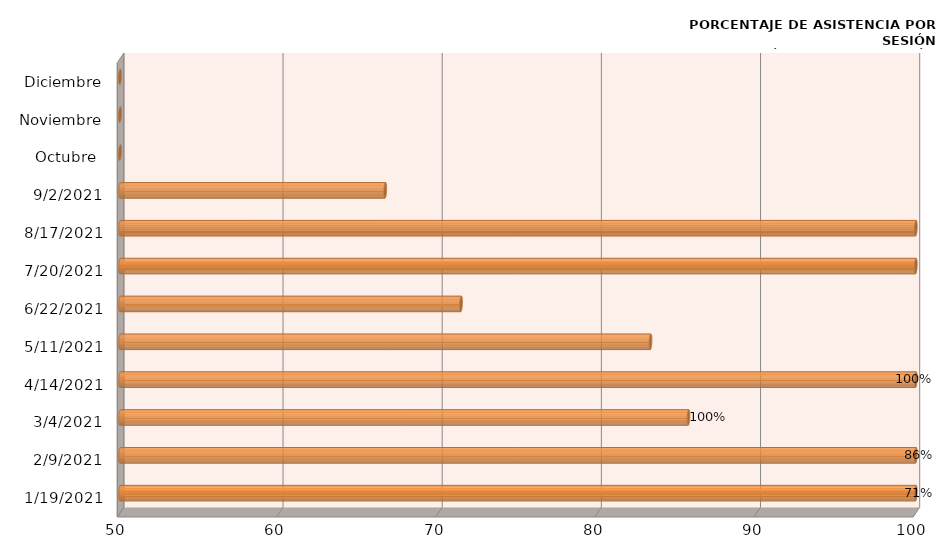
| Category | Series 0 |
|---|---|
| 19/01/2021 | 100 |
| 09/02/2021 | 100 |
| 04/03/2021 | 85.714 |
| 14/04/2021 | 100 |
| 11/05/2021 | 83.333 |
| 22/06/2021 | 71.429 |
| 20/07/2021 | 100 |
| 17/08/2021 | 100 |
| 02/09/2021 | 66.667 |
| Octubre  | 0 |
| Noviembre | 0 |
| Diciembre | 0 |